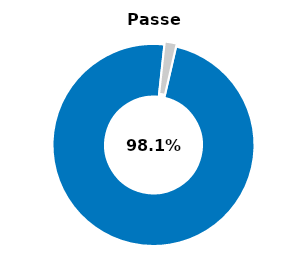
| Category | Series 0 |
|---|---|
| Passed | 0.981 |
| Other | 0.019 |